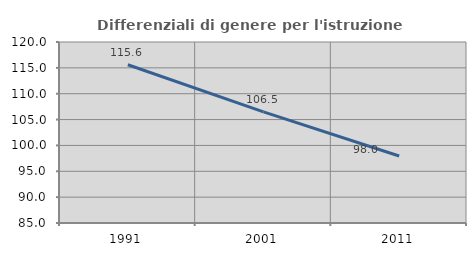
| Category | Differenziali di genere per l'istruzione superiore |
|---|---|
| 1991.0 | 115.596 |
| 2001.0 | 106.486 |
| 2011.0 | 97.953 |